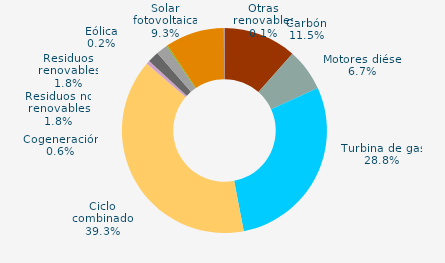
| Category | Series 0 |
|---|---|
| Carbón | 11.522 |
| Motores diésel | 6.659 |
| Turbina de gas | 28.811 |
| Ciclo combinado | 39.311 |
| Generación auxiliar | 0 |
| Cogeneración | 0.55 |
| Residuos no renovables | 1.787 |
| Residuos renovables | 1.787 |
| Eólica | 0.172 |
| Solar fotovoltaica | 9.299 |
| Otras renovables | 0.102 |